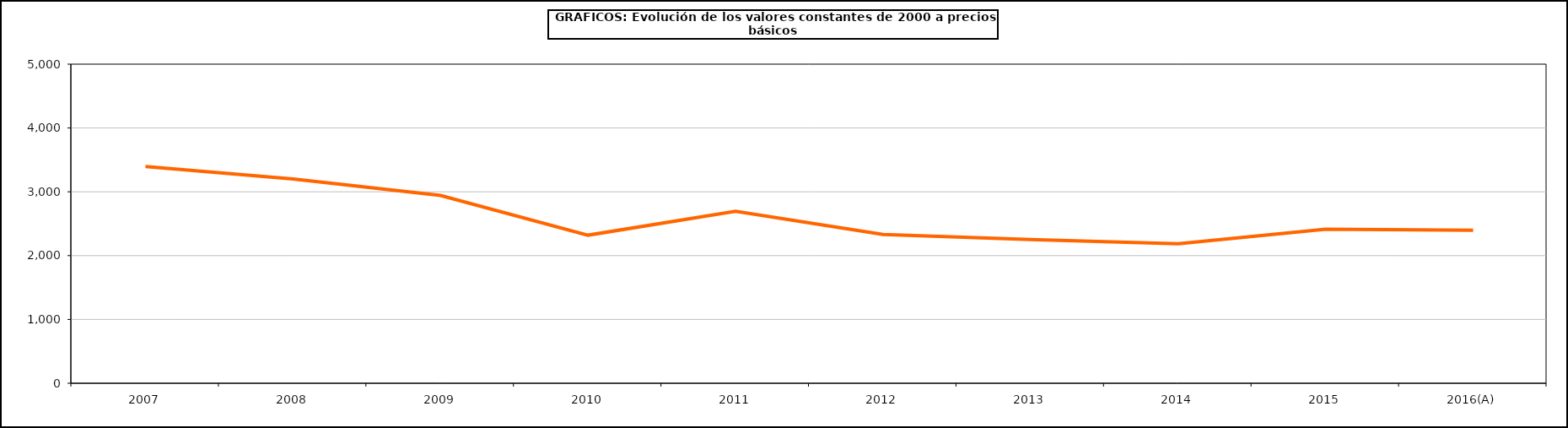
| Category | Formación bruta del capital fijo |
|---|---|
| 2007 | 3396.544 |
| 2008 | 3199.728 |
| 2009 | 2942.554 |
| 2010 | 2320.305 |
| 2011 | 2693.776 |
| 2012 | 2331.162 |
| 2013 | 2253.365 |
| 2014 | 2184.559 |
| 2015 | 2412.949 |
| 2016(A) | 2396.555 |